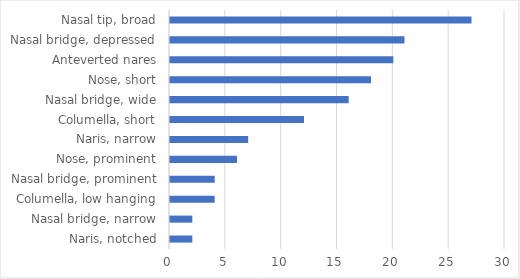
| Category | Series 0 |
|---|---|
| Naris, notched | 2 |
| Nasal bridge, narrow | 2 |
| Columella, low hanging | 4 |
| Nasal bridge, prominent | 4 |
| Nose, prominent | 6 |
| Naris, narrow | 7 |
| Columella, short | 12 |
| Nasal bridge, wide | 16 |
| Nose, short | 18 |
| Anteverted nares | 20 |
| Nasal bridge, depressed | 21 |
| Nasal tip, broad | 27 |